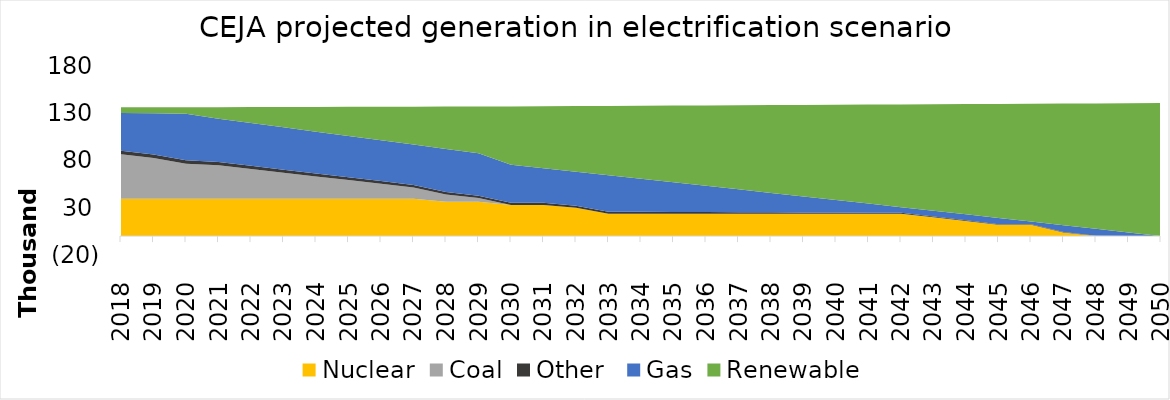
| Category | Nuclear | Coal | Other  | Gas | Renewable |
|---|---|---|---|---|---|
| 2018.0 | 39619.615 | 46981.414 | 3823.479 | 39909.675 | 5975.456 |
| 2019.0 | 39619.615 | 43066.296 | 3703.996 | 43562.896 | 6356.838 |
| 2020.0 | 39619.615 | 37025.025 | 3584.512 | 49317.928 | 6762.56 |
| 2021.0 | 39619.615 | 35258.893 | 3467.273 | 45824.03 | 12228.157 |
| 2022.0 | 39619.615 | 31361.534 | 3349.88 | 45299.555 | 16855.711 |
| 2023.0 | 39619.615 | 27459.101 | 3232.332 | 44774.33 | 21489.245 |
| 2024.0 | 39619.615 | 23551.594 | 3114.629 | 44248.354 | 26128.758 |
| 2025.0 | 39619.615 | 19639.014 | 2996.771 | 43721.628 | 30774.251 |
| 2026.0 | 39619.615 | 15721.359 | 2878.759 | 43194.152 | 35425.722 |
| 2027.0 | 39619.615 | 11798.63 | 2760.591 | 42665.925 | 40083.173 |
| 2028.0 | 36248.549 | 7870.827 | 2642.269 | 45508.014 | 44746.603 |
| 2029.0 | 36248.549 | 3937.951 | 2523.792 | 44978.286 | 49416.013 |
| 2030.0 | 32996.623 | 0 | 2405.16 | 40054.322 | 61736.813 |
| 2031.0 | 32996.623 | 0 | 2287.844 | 36491.135 | 65593.971 |
| 2032.0 | 29973.286 | 0 | 2170.218 | 35941.879 | 69460.845 |
| 2033.0 | 23723.063 | 0 | 2052.283 | 38610.103 | 73337.436 |
| 2034.0 | 23723.063 | 0 | 1934.038 | 35018.697 | 77223.742 |
| 2035.0 | 23723.063 | 0 | 1815.483 | 31417.884 | 81119.765 |
| 2036.0 | 23723.063 | 0 | 1696.619 | 27807.666 | 85025.503 |
| 2037.0 | 23723.063 | 0 | 1577.445 | 24188.041 | 88940.958 |
| 2038.0 | 23723.063 | 0 | 1457.961 | 20559.009 | 92866.128 |
| 2039.0 | 23723.063 | 0 | 1338.168 | 16920.572 | 96801.015 |
| 2040.0 | 23723.063 | 0 | 1218.065 | 13272.728 | 100745.618 |
| 2041.0 | 23723.063 | 0 | 1097.652 | 9615.477 | 104699.936 |
| 2042.0 | 23723.063 | 0 | 976.929 | 5948.82 | 108663.971 |
| 2043.0 | 19958.228 | 0 | 855.897 | 6037.592 | 112637.722 |
| 2044.0 | 15909.88 | 0 | 734.555 | 6400.471 | 116621.189 |
| 2045.0 | 11924.13 | 0 | 612.904 | 6691.344 | 120614.372 |
| 2046.0 | 11924.13 | 0 | 490.942 | 2987.062 | 124617.271 |
| 2047.0 | 3840.358 | 0 | 368.671 | 7357.146 | 128629.886 |
| 2048.0 | 0 | 0 | 246.091 | 7474.409 | 132652.217 |
| 2049.0 | 0 | 0 | 123.2 | 3741.908 | 136684.264 |
| 2050.0 | 0 | 0 | 0 | 0 | 140726.028 |